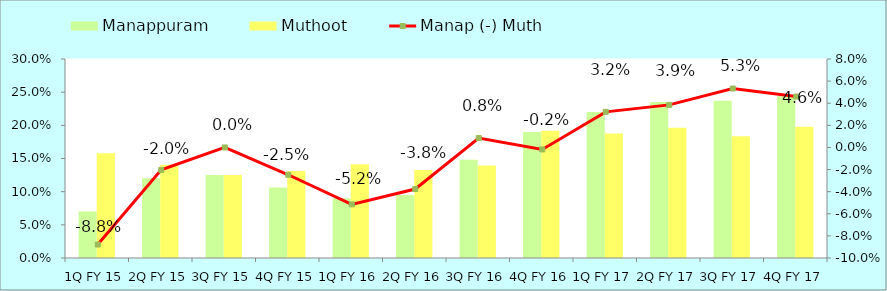
| Category | Manappuram | Muthoot |
|---|---|---|
| 1Q FY 15 | 0.07 | 0.158 |
| 2Q FY 15 | 0.12 | 0.141 |
| 3Q FY 15 | 0.125 | 0.125 |
| 4Q FY 15 | 0.106 | 0.131 |
| 1Q FY 16 | 0.09 | 0.142 |
| 2Q FY 16 | 0.095 | 0.133 |
| 3Q FY 16 | 0.148 | 0.14 |
| 4Q FY 16 | 0.19 | 0.192 |
| 1Q FY 17 | 0.22 | 0.188 |
| 2Q FY 17 | 0.235 | 0.196 |
| 3Q FY 17 | 0.237 | 0.184 |
| 4Q FY 17 | 0.244 | 0.198 |